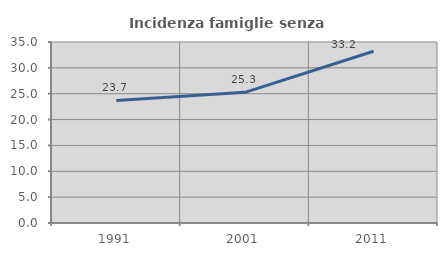
| Category | Incidenza famiglie senza nuclei |
|---|---|
| 1991.0 | 23.698 |
| 2001.0 | 25.262 |
| 2011.0 | 33.221 |